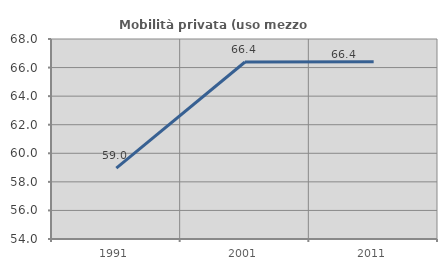
| Category | Mobilità privata (uso mezzo privato) |
|---|---|
| 1991.0 | 58.966 |
| 2001.0 | 66.39 |
| 2011.0 | 66.402 |